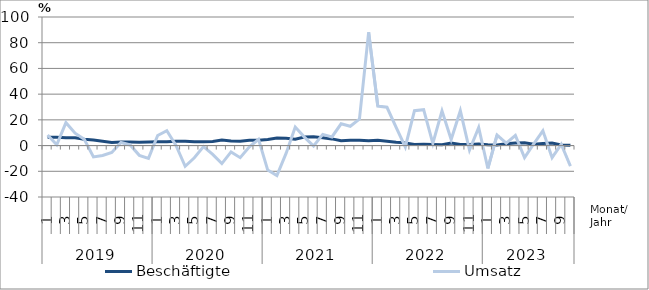
| Category | Beschäftigte | Umsatz |
|---|---|---|
| 0 | 6.4 | 8.2 |
| 1 | 6.5 | 0.6 |
| 2 | 6 | 17.8 |
| 3 | 6.1 | 9.6 |
| 4 | 4.9 | 4.9 |
| 5 | 4.3 | -8.8 |
| 6 | 3.3 | -7.7 |
| 7 | 2.4 | -5.4 |
| 8 | 2.8 | 2.4 |
| 9 | 2.7 | 0.5 |
| 10 | 2.5 | -7.6 |
| 11 | 2.7 | -10 |
| 12 | 2.9 | 7.8 |
| 13 | 2.9 | 11.5 |
| 14 | 3.4 | 0.1 |
| 15 | 3.4 | -16.1 |
| 16 | 2.9 | -9.5 |
| 17 | 2.9 | -0.8 |
| 18 | 3.1 | -6.9 |
| 19 | 4.3 | -14 |
| 20 | 3.6 | -4.9 |
| 21 | 3.4 | -9.4 |
| 22 | 4.1 | -0.9 |
| 23 | 4.1 | 4.9 |
| 24 | 4.8 | -19.1 |
| 25 | 5.8 | -23.3 |
| 26 | 5.6 | -6.1 |
| 27 | 5 | 14.4 |
| 28 | 6.6 | 6.6 |
| 29 | 6.9 | -0.3 |
| 30 | 6 | 8.7 |
| 31 | 5.2 | 6.7 |
| 32 | 3.8 | 16.9 |
| 33 | 4.2 | 15 |
| 34 | 4.2 | 20.6 |
| 35 | 3.7 | 88.1 |
| 36 | 4.1 | 30.7 |
| 37 | 3.4 | 29.8 |
| 38 | 2.6 | 14.1 |
| 39 | 2.1 | -1.1 |
| 40 | 0.9 | 27.1 |
| 41 | 1 | 27.9 |
| 42 | 0.8 | 1.7 |
| 43 | 0.7 | 27 |
| 44 | 2 | 4.7 |
| 45 | 0.9 | 27.1 |
| 46 | 0.9 | -3.5 |
| 47 | 1.2 | 14.1 |
| 48 | 0.6 | -17.8 |
| 49 | 0.5 | 8.2 |
| 50 | 1.4 | 1.9 |
| 51 | 2 | 7.9 |
| 52 | 2.2 | -9.4 |
| 53 | 1 | 1.3 |
| 54 | 1.6 | 11.5 |
| 55 | 2 | -9.4 |
| 56 | 0.5 | 1 |
| 57 | 0.2 | -16 |